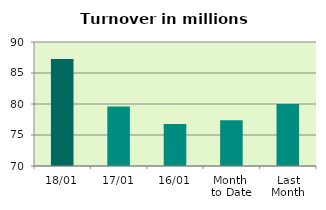
| Category | Series 0 |
|---|---|
| 18/01 | 87.261 |
| 17/01 | 79.616 |
| 16/01 | 76.784 |
| Month 
to Date | 77.398 |
| Last
Month | 79.992 |